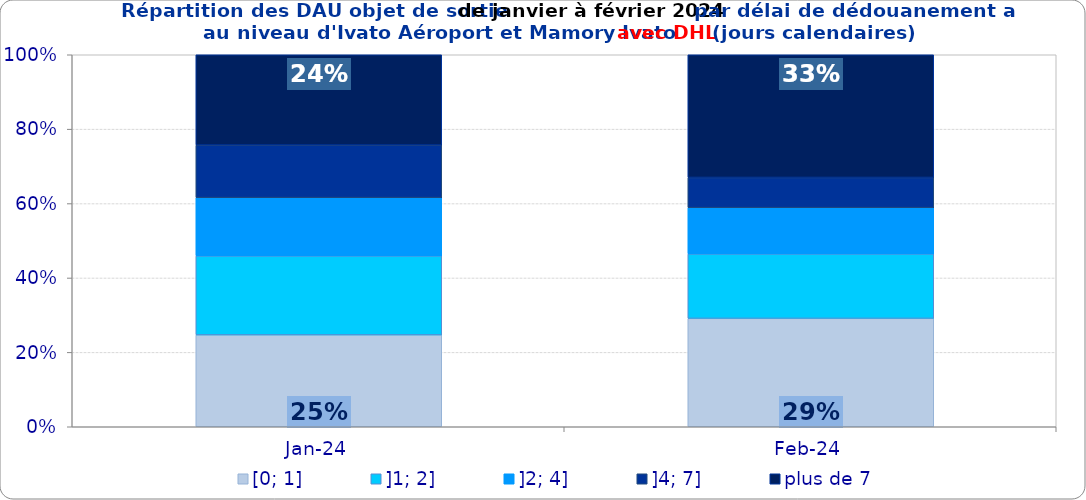
| Category | [0; 1] | ]1; 2] | ]2; 4] | ]4; 7] | plus de 7 |
|---|---|---|---|---|---|
| 2024-01-01 | 0.247 | 0.212 | 0.157 | 0.141 | 0.243 |
| 2024-02-01 | 0.291 | 0.173 | 0.124 | 0.081 | 0.33 |